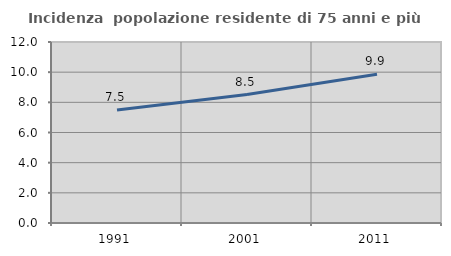
| Category | Incidenza  popolazione residente di 75 anni e più |
|---|---|
| 1991.0 | 7.492 |
| 2001.0 | 8.516 |
| 2011.0 | 9.869 |